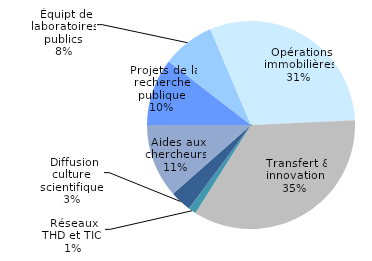
| Category | Series 0 |
|---|---|
|  Projets de la recherche publique | 0.105 |
|  Équipt de laboratoires publics | 0.081 |
|  Opérations immobilières | 0.307 |
|  Transfert & innovation | 0.347 |
| Réseaux THD et TIC  | 0.012 |
|  Diffusion culture scientifique | 0.033 |
|  Aides aux chercheurs | 0.115 |